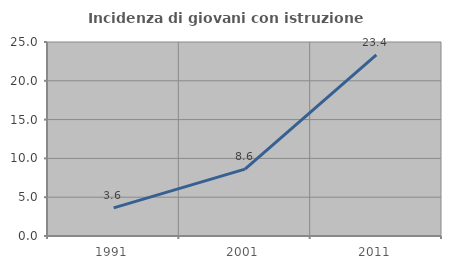
| Category | Incidenza di giovani con istruzione universitaria |
|---|---|
| 1991.0 | 3.632 |
| 2001.0 | 8.613 |
| 2011.0 | 23.35 |